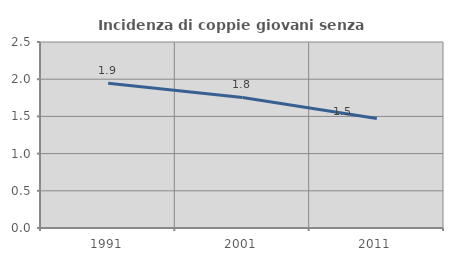
| Category | Incidenza di coppie giovani senza figli |
|---|---|
| 1991.0 | 1.946 |
| 2001.0 | 1.754 |
| 2011.0 | 1.471 |